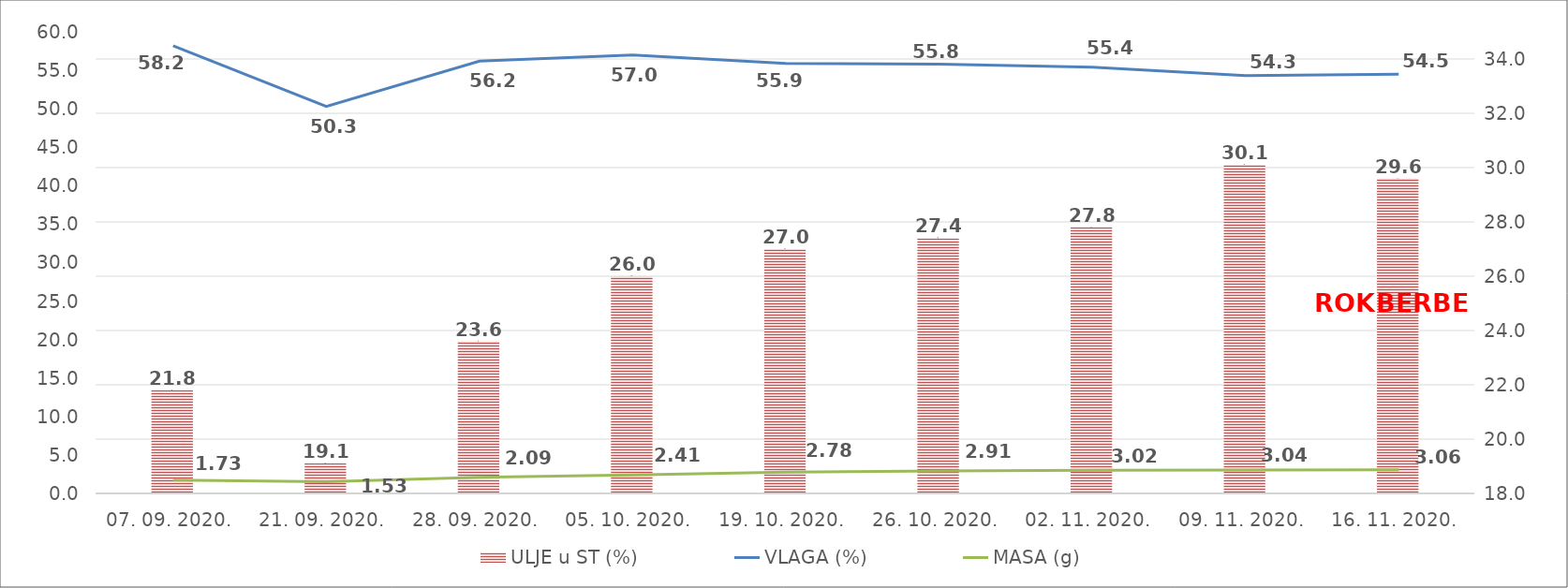
| Category | ULJE u ST (%) |
|---|---|
| 07. 09. 2020. | 21.8 |
| 21. 09. 2020. | 19.1 |
| 28. 09. 2020. | 23.6 |
| 05. 10. 2020. | 26 |
| 19. 10. 2020. | 27 |
| 26. 10. 2020. | 27.4 |
| 02. 11. 2020. | 27.8 |
| 09. 11. 2020. | 30.1 |
| 16. 11. 2020. | 29.6 |